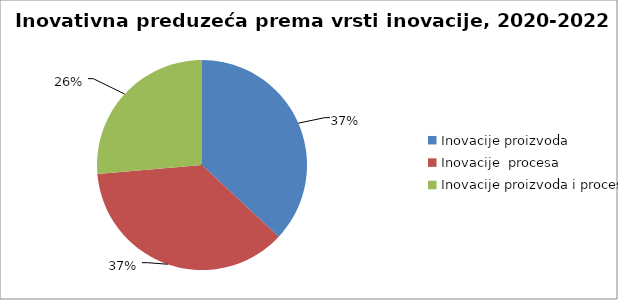
| Category | Inovativna preduzeća prema vrsti inovacije, 2018-2020 |
|---|---|
| Inovacije proizvoda  | 1896 |
| Inovacije  procesa  | 1881 |
| Inovacije proizvoda i procesa     | 1353 |